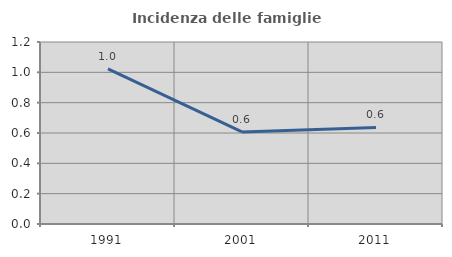
| Category | Incidenza delle famiglie numerose |
|---|---|
| 1991.0 | 1.022 |
| 2001.0 | 0.607 |
| 2011.0 | 0.637 |